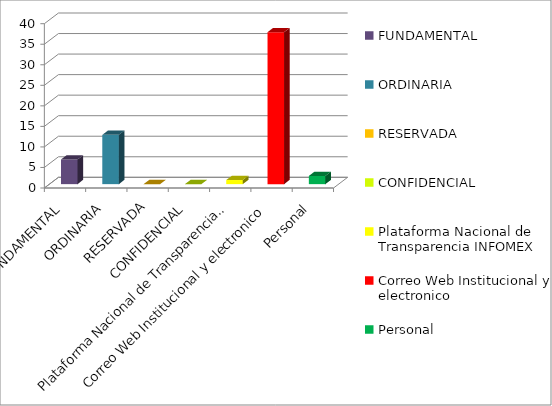
| Category | Series 2 |
|---|---|
| FUNDAMENTAL | 6 |
| ORDINARIA | 12 |
| RESERVADA | 0 |
| CONFIDENCIAL | 0 |
| Plataforma Nacional de Transparencia INFOMEX | 1 |
| Correo Web Institucional y electronico | 37 |
| Personal | 2 |